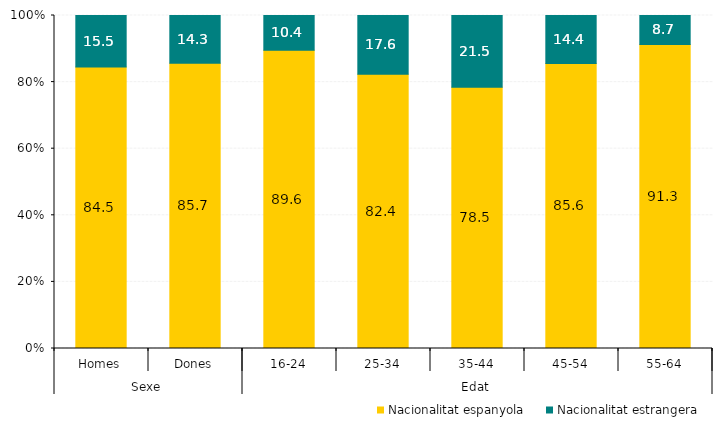
| Category | Nacionalitat espanyola | Nacionalitat estrangera |
|---|---|---|
| 0 | 84.537 | 15.463 |
| 1 | 85.697 | 14.303 |
| 2 | 89.566 | 10.434 |
| 3 | 82.375 | 17.625 |
| 4 | 78.461 | 21.539 |
| 5 | 85.607 | 14.393 |
| 6 | 91.326 | 8.674 |